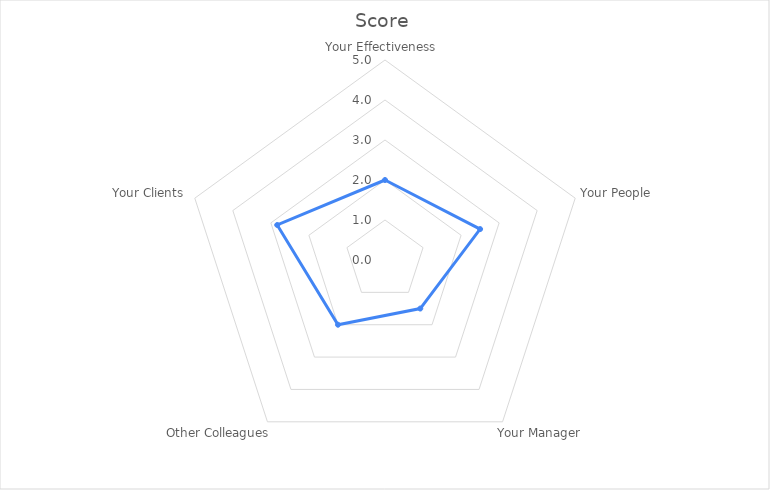
| Category | Score |
|---|---|
| Your Effectiveness  | 2 |
| Your People | 2.5 |
| Your Manager | 1.5 |
| Other Colleagues | 2 |
| Your Clients | 2.833 |